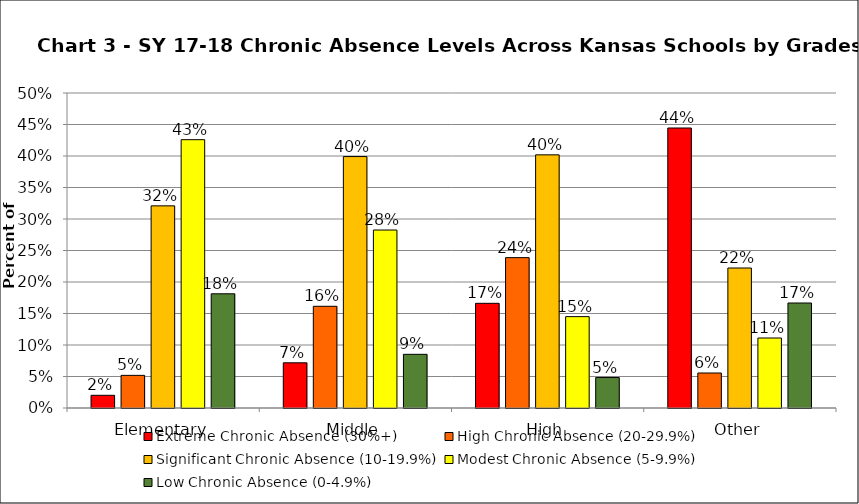
| Category | Extreme Chronic Absence (30%+) | High Chronic Absence (20-29.9%) | Significant Chronic Absence (10-19.9%) | Modest Chronic Absence (5-9.9%) | Low Chronic Absence (0-4.9%) |
|---|---|---|---|---|---|
| 0 | 0.02 | 0.052 | 0.321 | 0.426 | 0.181 |
| 1 | 0.072 | 0.161 | 0.399 | 0.283 | 0.085 |
| 2 | 0.166 | 0.239 | 0.402 | 0.145 | 0.048 |
| 3 | 0.444 | 0.056 | 0.222 | 0.111 | 0.167 |